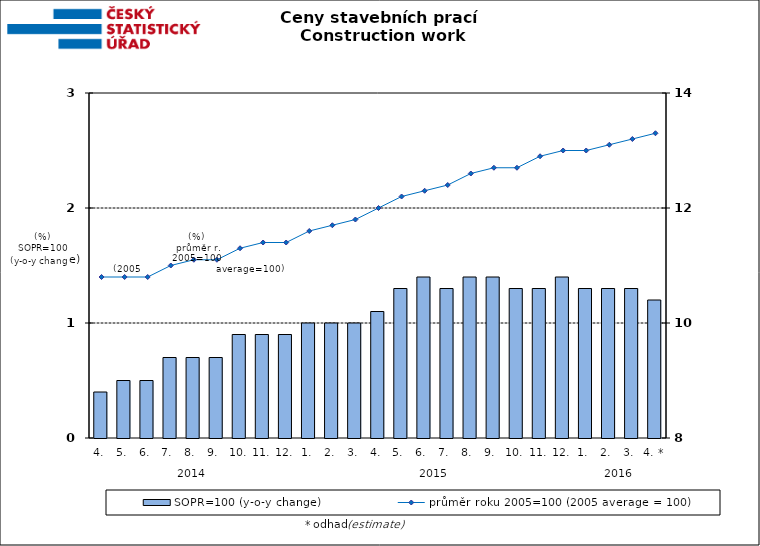
| Category | SOPR=100 (y-o-y change)   |
|---|---|
| 0 | 0.4 |
| 1 | 0.5 |
| 2 | 0.5 |
| 3 | 0.7 |
| 4 | 0.7 |
| 5 | 0.7 |
| 6 | 0.9 |
| 7 | 0.9 |
| 8 | 0.9 |
| 9 | 1 |
| 10 | 1 |
| 11 | 1 |
| 12 | 1.1 |
| 13 | 1.3 |
| 14 | 1.4 |
| 15 | 1.3 |
| 16 | 1.4 |
| 17 | 1.4 |
| 18 | 1.3 |
| 19 | 1.3 |
| 20 | 1.4 |
| 21 | 1.3 |
| 22 | 1.3 |
| 23 | 1.3 |
| 24 | 1.2 |